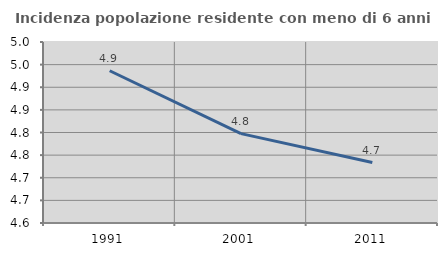
| Category | Incidenza popolazione residente con meno di 6 anni |
|---|---|
| 1991.0 | 4.936 |
| 2001.0 | 4.798 |
| 2011.0 | 4.734 |